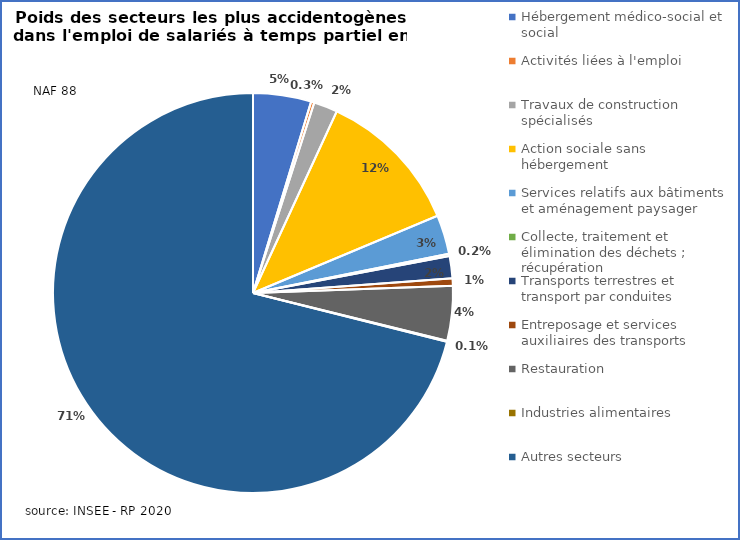
| Category | Series 0 |
|---|---|
| Hébergement médico-social et social | 0.047 |
| Activités liées à l'emploi | 0.003 |
| Travaux de construction spécialisés | 0.019 |
| Action sociale sans hébergement | 0.118 |
| Services relatifs aux bâtiments et aménagement paysager | 0.032 |
| Collecte, traitement et élimination des déchets ; récupération | 0.002 |
| Transports terrestres et transport par conduites | 0.018 |
| Entreposage et services auxiliaires des transports | 0.006 |
| Restauration | 0.044 |
| Industries alimentaires | 0.001 |
| Autres secteurs | 0.711 |